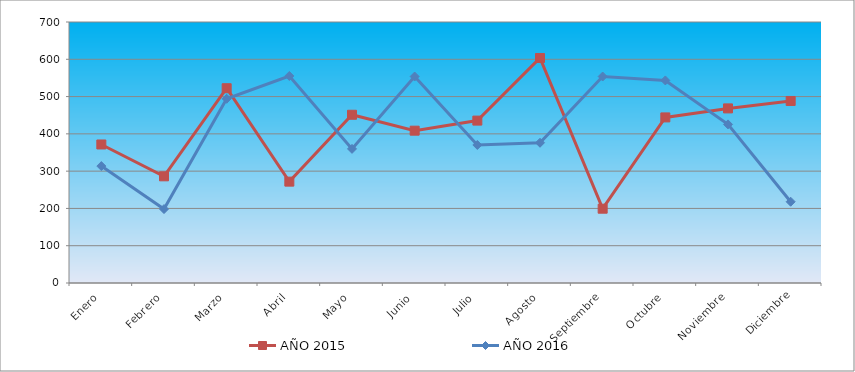
| Category | AÑO 2015 | AÑO 2016 |
|---|---|---|
| Enero | 371.508 | 313.571 |
| Febrero | 286.104 | 198.267 |
| Marzo | 522.388 | 494.053 |
| Abril | 271.87 | 555.25 |
| Mayo | 451.218 | 359.718 |
| Junio | 408.516 | 553.757 |
| Julio | 435.561 | 370.167 |
| Agosto | 603.522 | 376.137 |
| Septiembre | 199.276 | 553.757 |
| Octubre | 444.101 | 543.309 |
| Noviembre | 468.299 | 425.393 |
| Diciembre | 488.227 | 217.921 |